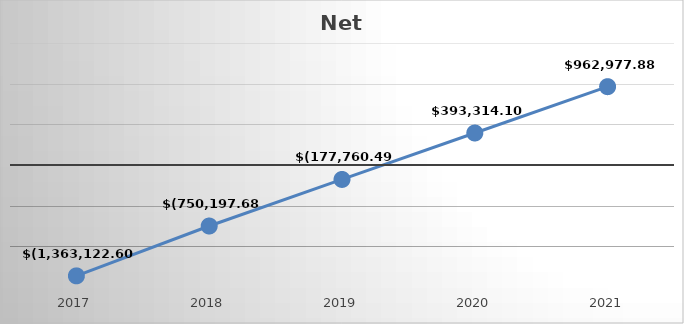
| Category | Series 0 |
|---|---|
| 2017.0 | -1363122.6 |
| 2018.0 | -750197.677 |
| 2019.0 | -177760.49 |
| 2020.0 | 393314.098 |
| 2021.0 | 962977.881 |